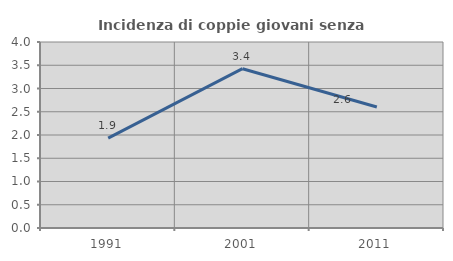
| Category | Incidenza di coppie giovani senza figli |
|---|---|
| 1991.0 | 1.931 |
| 2001.0 | 3.426 |
| 2011.0 | 2.603 |